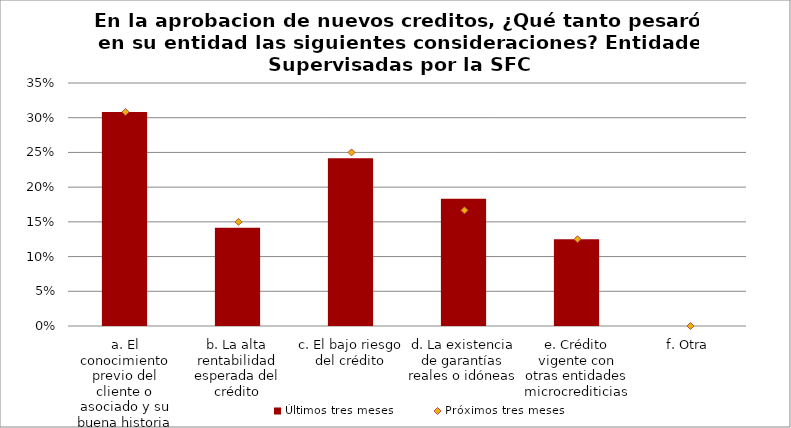
| Category | Últimos tres meses |
|---|---|
| a. El conocimiento previo del cliente o asociado y su buena historia de crédito | 0.308 |
| b. La alta rentabilidad esperada del crédito | 0.142 |
| c. El bajo riesgo del crédito | 0.242 |
| d. La existencia de garantías reales o idóneas | 0.183 |
| e. Crédito vigente con otras entidades microcrediticias | 0.125 |
| f. Otra | 0 |